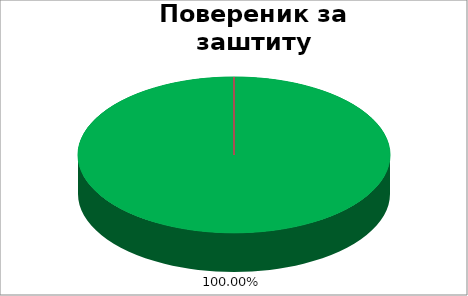
| Category | Повереник за заштиту равноправности  |
|---|---|
| 0 | 1 |
| 1 | 0 |
| 2 | 0 |
| 3 | 0 |
| 4 | 0 |